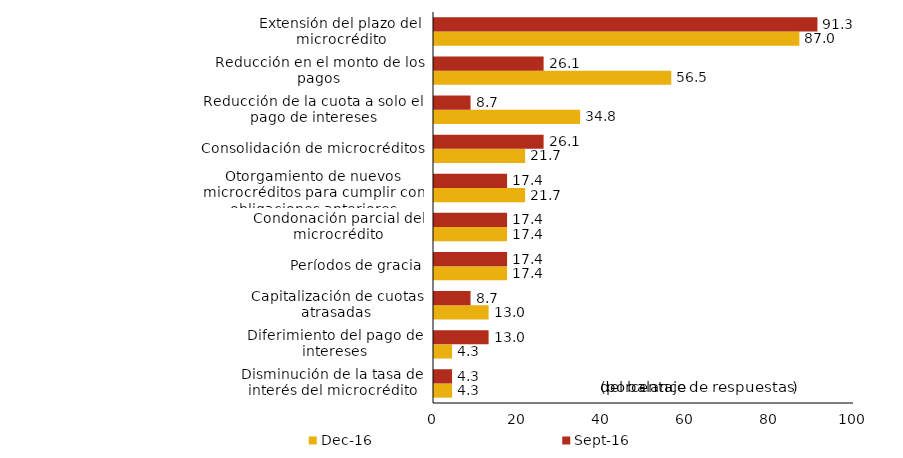
| Category | dic-16 | sep-16 |
|---|---|---|
| Disminución de la tasa de interés del microcrédito | 4.3 | 4.3 |
| Diferimiento del pago de intereses | 4.3 | 13 |
| Capitalización de cuotas atrasadas | 13 | 8.7 |
| Períodos de gracia | 17.4 | 17.4 |
| Condonación parcial del microcrédito | 17.4 | 17.4 |
| Otorgamiento de nuevos microcréditos para cumplir con obligaciones anteriores | 21.7 | 17.4 |
| Consolidación de microcréditos | 21.7 | 26.1 |
| Reducción de la cuota a solo el pago de intereses | 34.8 | 8.7 |
| Reducción en el monto de los pagos | 56.5 | 26.1 |
| Extensión del plazo del microcrédito | 87 | 91.3 |